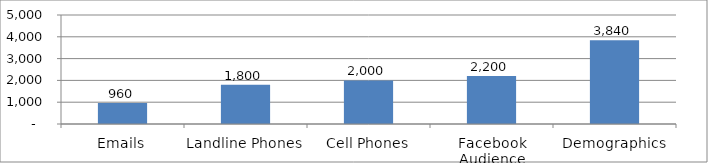
| Category | Series 0 |
|---|---|
| Emails | 960 |
| Landline Phones | 1800 |
| Cell Phones | 2000 |
| Facebook Audience | 2200 |
| Demographics | 3840 |